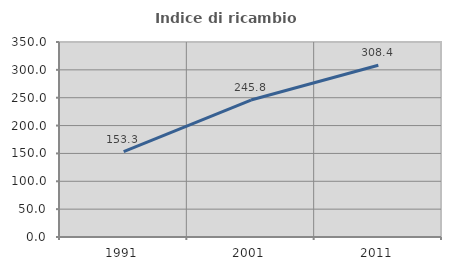
| Category | Indice di ricambio occupazionale  |
|---|---|
| 1991.0 | 153.282 |
| 2001.0 | 245.806 |
| 2011.0 | 308.383 |